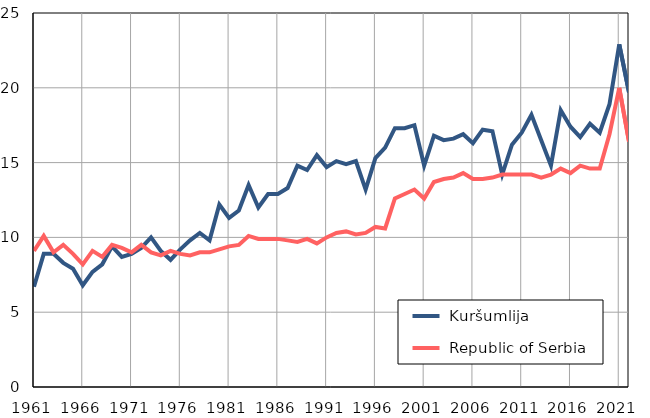
| Category |  Kuršumlija |  Republic of Serbia |
|---|---|---|
| 1961.0 | 6.7 | 9.1 |
| 1962.0 | 8.9 | 10.1 |
| 1963.0 | 8.9 | 9 |
| 1964.0 | 8.3 | 9.5 |
| 1965.0 | 7.9 | 8.9 |
| 1966.0 | 6.8 | 8.2 |
| 1967.0 | 7.7 | 9.1 |
| 1968.0 | 8.2 | 8.7 |
| 1969.0 | 9.4 | 9.5 |
| 1970.0 | 8.7 | 9.3 |
| 1971.0 | 8.9 | 9 |
| 1972.0 | 9.3 | 9.5 |
| 1973.0 | 10 | 9 |
| 1974.0 | 9.1 | 8.8 |
| 1975.0 | 8.5 | 9.1 |
| 1976.0 | 9.2 | 8.9 |
| 1977.0 | 9.8 | 8.8 |
| 1978.0 | 10.3 | 9 |
| 1979.0 | 9.8 | 9 |
| 1980.0 | 12.2 | 9.2 |
| 1981.0 | 11.3 | 9.4 |
| 1982.0 | 11.8 | 9.5 |
| 1983.0 | 13.5 | 10.1 |
| 1984.0 | 12 | 9.9 |
| 1985.0 | 12.9 | 9.9 |
| 1986.0 | 12.9 | 9.9 |
| 1987.0 | 13.3 | 9.8 |
| 1988.0 | 14.8 | 9.7 |
| 1989.0 | 14.5 | 9.9 |
| 1990.0 | 15.5 | 9.6 |
| 1991.0 | 14.7 | 10 |
| 1992.0 | 15.1 | 10.3 |
| 1993.0 | 14.9 | 10.4 |
| 1994.0 | 15.1 | 10.2 |
| 1995.0 | 13.2 | 10.3 |
| 1996.0 | 15.3 | 10.7 |
| 1997.0 | 16 | 10.6 |
| 1998.0 | 17.3 | 12.6 |
| 1999.0 | 17.3 | 12.9 |
| 2000.0 | 17.5 | 13.2 |
| 2001.0 | 14.8 | 12.6 |
| 2002.0 | 16.8 | 13.7 |
| 2003.0 | 16.5 | 13.9 |
| 2004.0 | 16.6 | 14 |
| 2005.0 | 16.9 | 14.3 |
| 2006.0 | 16.3 | 13.9 |
| 2007.0 | 17.2 | 13.9 |
| 2008.0 | 17.1 | 14 |
| 2009.0 | 14.2 | 14.2 |
| 2010.0 | 16.2 | 14.2 |
| 2011.0 | 17 | 14.2 |
| 2012.0 | 18.2 | 14.2 |
| 2013.0 | 16.5 | 14 |
| 2014.0 | 14.8 | 14.2 |
| 2015.0 | 18.5 | 14.6 |
| 2016.0 | 17.4 | 14.3 |
| 2017.0 | 16.7 | 14.8 |
| 2018.0 | 17.6 | 14.6 |
| 2019.0 | 17 | 14.6 |
| 2020.0 | 18.9 | 16.9 |
| 2021.0 | 22.9 | 20 |
| 2022.0 | 19.7 | 16.4 |